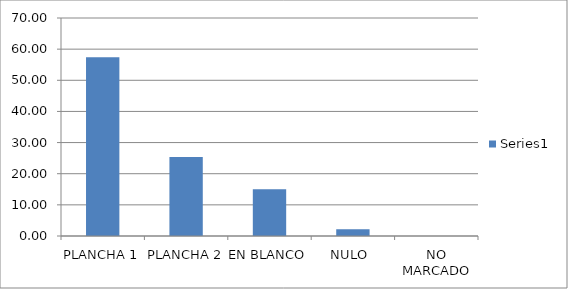
| Category | Series 0 |
|---|---|
| PLANCHA 1 | 57.367 |
| PLANCHA 2 | 25.392 |
| EN BLANCO | 15.047 |
| NULO  | 2.194 |
| NO MARCADO | 0 |